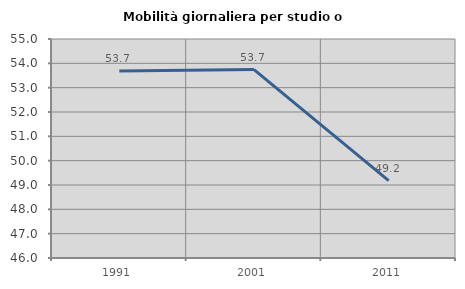
| Category | Mobilità giornaliera per studio o lavoro |
|---|---|
| 1991.0 | 53.69 |
| 2001.0 | 53.744 |
| 2011.0 | 49.182 |